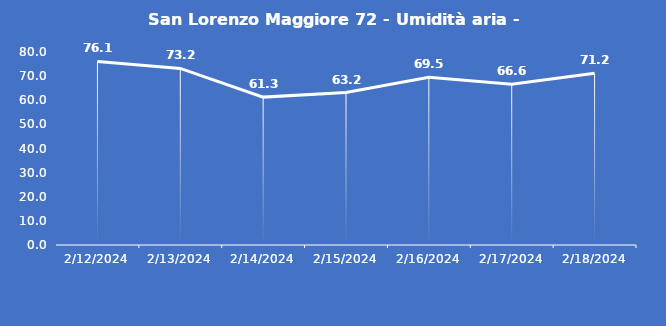
| Category | San Lorenzo Maggiore 72 - Umidità aria - Grezzo (%) |
|---|---|
| 2/12/24 | 76.1 |
| 2/13/24 | 73.2 |
| 2/14/24 | 61.3 |
| 2/15/24 | 63.2 |
| 2/16/24 | 69.5 |
| 2/17/24 | 66.6 |
| 2/18/24 | 71.2 |